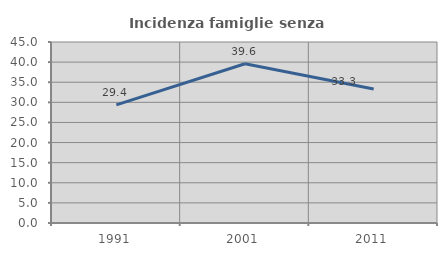
| Category | Incidenza famiglie senza nuclei |
|---|---|
| 1991.0 | 29.365 |
| 2001.0 | 39.589 |
| 2011.0 | 33.333 |